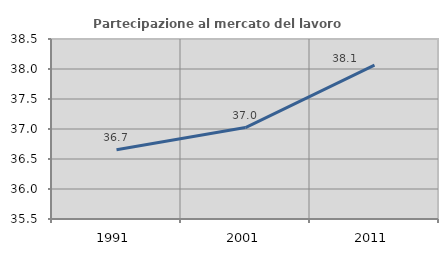
| Category | Partecipazione al mercato del lavoro  femminile |
|---|---|
| 1991.0 | 36.655 |
| 2001.0 | 37.023 |
| 2011.0 | 38.065 |